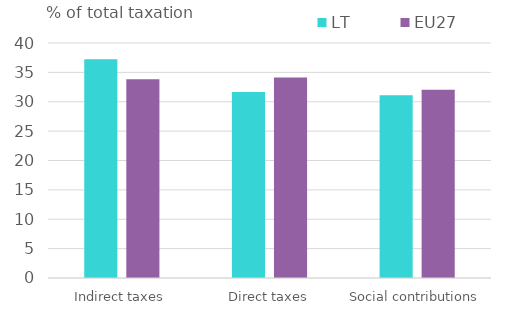
| Category | LT | EU27 |
|---|---|---|
| Indirect taxes | 37.245 | 33.811 |
| Direct taxes | 31.64 | 34.133 |
| Social contributions | 31.114 | 32.056 |